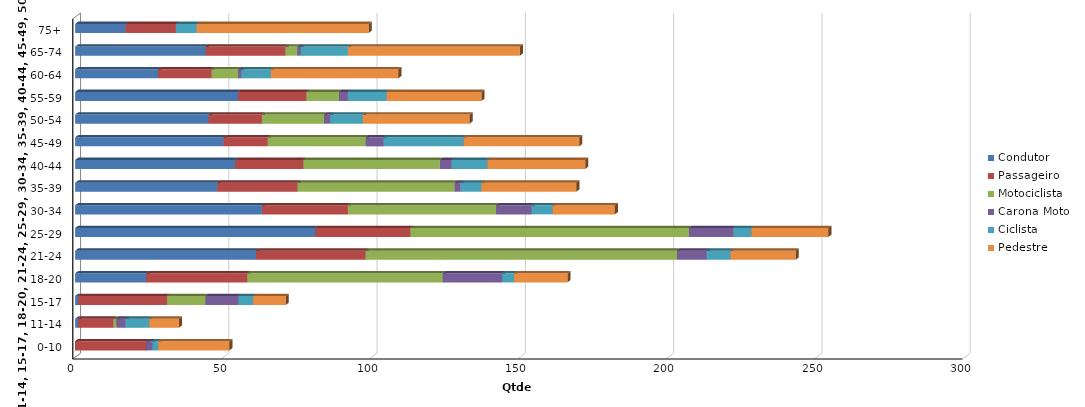
| Category | Condutor | Passageiro | Motociclista | Carona Moto | Ciclista | Pedestre |
|---|---|---|---|---|---|---|
| 0-10 | 0 | 24 | 0 | 2 | 2 | 24 |
| 11-14 | 1 | 12 | 1 | 3 | 8 | 10 |
| 15-17 | 1 | 30 | 13 | 11 | 5 | 11 |
| 18-20 | 24 | 34 | 66 | 20 | 4 | 18 |
| 21-24 | 61 | 37 | 105 | 10 | 8 | 22 |
| 25-29 | 81 | 32 | 94 | 15 | 6 | 26 |
| 30-34 | 63 | 29 | 50 | 12 | 7 | 21 |
| 35-39 | 48 | 27 | 53 | 2 | 7 | 32 |
| 40-44 | 54 | 23 | 46 | 4 | 12 | 33 |
| 45-49 | 50 | 15 | 33 | 6 | 27 | 39 |
| 50-54 | 45 | 18 | 21 | 2 | 11 | 36 |
| 55-59 | 55 | 23 | 11 | 3 | 13 | 32 |
| 60-64 | 28 | 18 | 9 | 1 | 10 | 43 |
| 65-74 | 44 | 27 | 4 | 1 | 16 | 58 |
| 75+ | 17 | 17 | 0 | 0 | 7 | 58 |